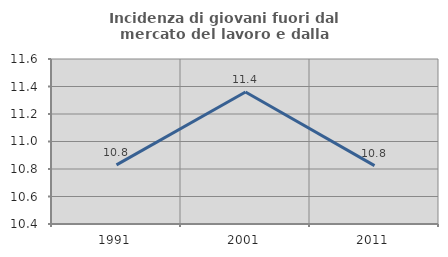
| Category | Incidenza di giovani fuori dal mercato del lavoro e dalla formazione  |
|---|---|
| 1991.0 | 10.83 |
| 2001.0 | 11.36 |
| 2011.0 | 10.825 |